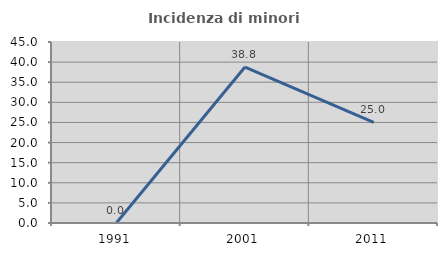
| Category | Incidenza di minori stranieri |
|---|---|
| 1991.0 | 0 |
| 2001.0 | 38.776 |
| 2011.0 | 25 |